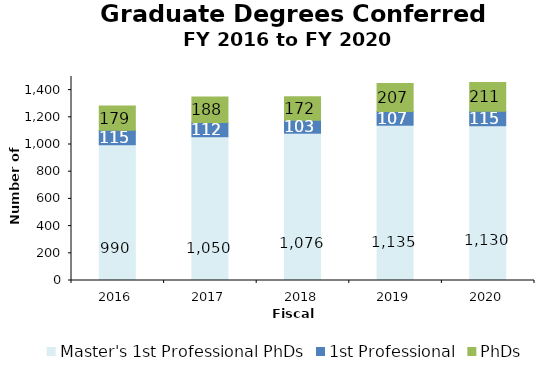
| Category | Master's 1st Professional PhDs | 1st Professional | PhDs |
|---|---|---|---|
| 2016.0 | 990 | 115 | 179 |
| 2017.0 | 1050 | 112 | 188 |
| 2018.0 | 1076 | 103 | 172 |
| 2019.0 | 1135 | 107 | 207 |
| 2020.0 | 1130 | 115 | 211 |